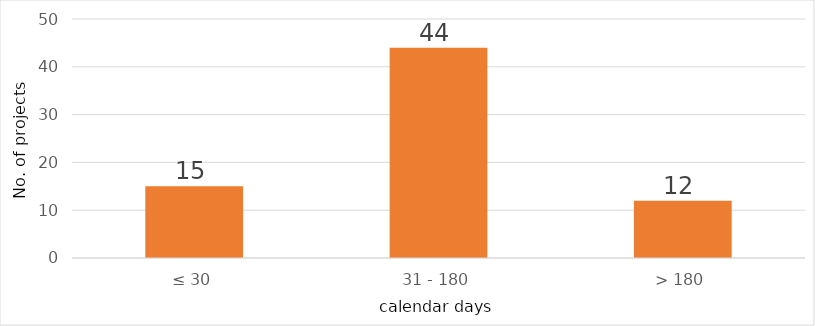
| Category | Series 0 |
|---|---|
| 0 | 15 |
| 1 | 44 |
| 2 | 12 |